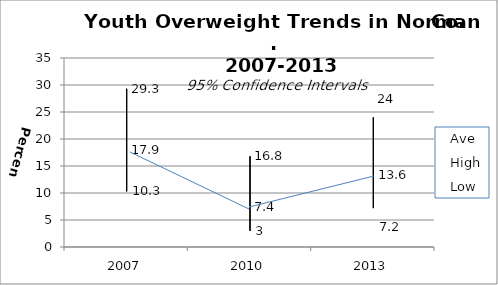
| Category | Ave | High | Low |
|---|---|---|---|
| 2007.0 | 17.9 | 29.3 | 10.3 |
| 2010.0 | 7.4 | 16.8 | 3 |
| 2013.0 | 13.6 | 24 | 7.2 |